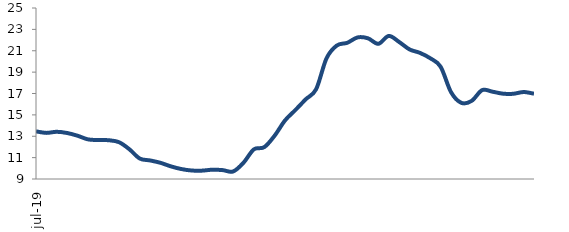
| Category | Series 0 |
|---|---|
| 2019-07-01 | 13.459 |
| 2019-08-01 | 13.315 |
| 2019-09-01 | 13.417 |
| 2019-10-01 | 13.304 |
| 2019-11-01 | 13.05 |
| 2019-12-01 | 12.71 |
| 2020-01-01 | 12.642 |
| 2020-02-01 | 12.627 |
| 2020-03-01 | 12.445 |
| 2020-04-01 | 11.784 |
| 2020-05-01 | 10.914 |
| 2020-06-01 | 10.736 |
| 2020-07-01 | 10.514 |
| 2020-08-01 | 10.182 |
| 2020-09-01 | 9.933 |
| 2020-10-01 | 9.795 |
| 2020-11-01 | 9.783 |
| 2020-12-01 | 9.869 |
| 2021-01-01 | 9.83 |
| 2021-02-01 | 9.703 |
| 2021-03-01 | 10.521 |
| 2021-04-01 | 11.773 |
| 2021-05-01 | 11.98 |
| 2021-06-01 | 13.052 |
| 2021-07-01 | 14.478 |
| 2021-08-01 | 15.452 |
| 2021-09-01 | 16.459 |
| 2021-10-01 | 17.401 |
| 2021-11-01 | 20.289 |
| 2021-12-01 | 21.495 |
| 2022-01-01 | 21.744 |
| 2022-02-01 | 22.249 |
| 2022-03-01 | 22.164 |
| 2022-04-01 | 21.65 |
| 2022-05-01 | 22.386 |
| 2022-06-01 | 21.821 |
| 2022-07-01 | 21.126 |
| 2022-08-01 | 20.803 |
| 2022-09-01 | 20.298 |
| 2022-10-01 | 19.505 |
| 2022-11-01 | 17.131 |
| 2022-12-01 | 16.123 |
| 2023-01-01 | 16.316 |
| 2023-02-01 | 17.317 |
| 2023-03-01 | 17.168 |
| 2023-04-01 | 16.986 |
| 2023-05-01 | 16.972 |
| 2023-06-01 | 17.138 |
| 2023-07-01 | 16.98 |